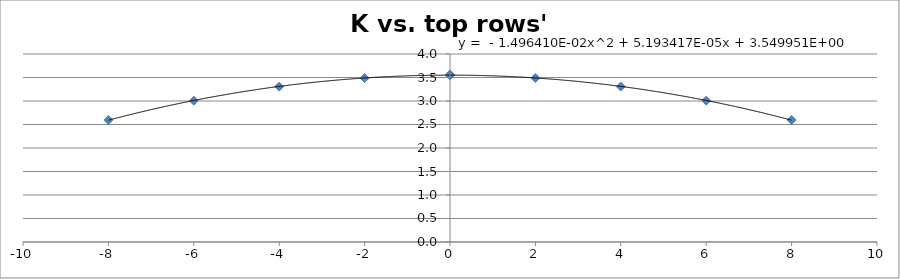
| Category | K vs. top rows shift |
|---|---|
| 0.0 | 3.565 |
| 2.0 | 3.49 |
| 4.0 | 3.307 |
| 6.0 | 3.007 |
| 8.0 | 2.596 |
| 0.0 | 3.549 |
| -2.0 | 3.487 |
| -4.0 | 3.306 |
| -6.0 | 3.007 |
| -8.0 | 2.596 |
| 0.0 | 3.548 |